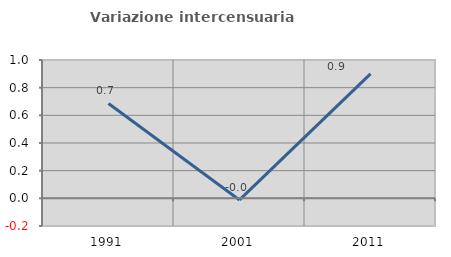
| Category | Variazione intercensuaria annua |
|---|---|
| 1991.0 | 0.686 |
| 2001.0 | -0.011 |
| 2011.0 | 0.9 |